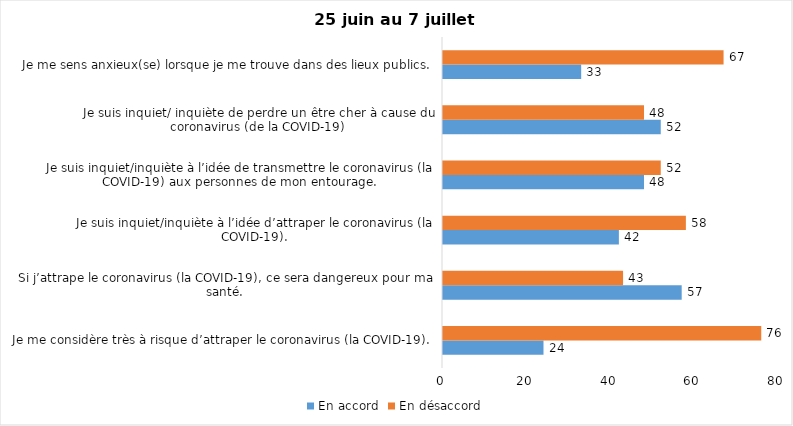
| Category | En accord | En désaccord |
|---|---|---|
| Je me considère très à risque d’attraper le coronavirus (la COVID-19). | 24 | 76 |
| Si j’attrape le coronavirus (la COVID-19), ce sera dangereux pour ma santé. | 57 | 43 |
| Je suis inquiet/inquiète à l’idée d’attraper le coronavirus (la COVID-19). | 42 | 58 |
| Je suis inquiet/inquiète à l’idée de transmettre le coronavirus (la COVID-19) aux personnes de mon entourage. | 48 | 52 |
| Je suis inquiet/ inquiète de perdre un être cher à cause du coronavirus (de la COVID-19) | 52 | 48 |
| Je me sens anxieux(se) lorsque je me trouve dans des lieux publics. | 33 | 67 |